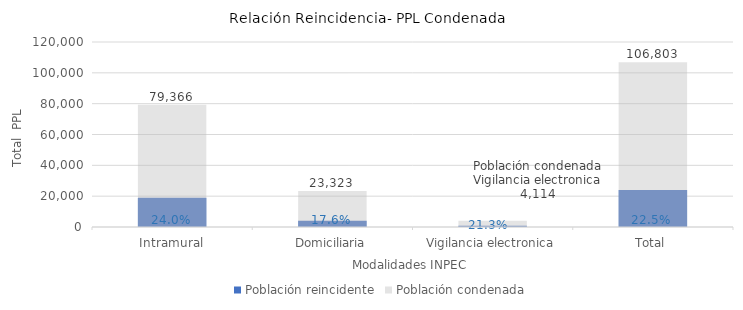
| Category | Población reincidente | Población condenada |
|---|---|---|
| Intramural | 19022 | 79366 |
| Domiciliaria | 4095 | 23323 |
| Vigilancia electronica | 875 | 4114 |
| Total | 23992 | 106803 |